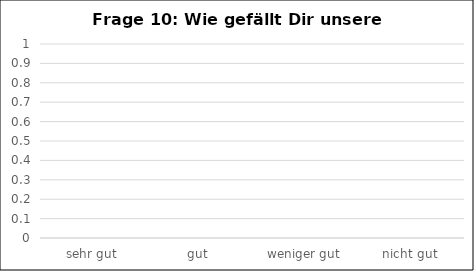
| Category | Series 0 |
|---|---|
| sehr gut | 0 |
| gut | 0 |
| weniger gut | 0 |
| nicht gut | 0 |